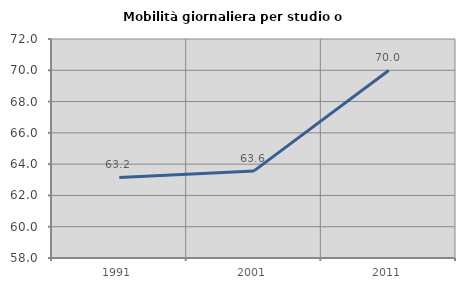
| Category | Mobilità giornaliera per studio o lavoro |
|---|---|
| 1991.0 | 63.152 |
| 2001.0 | 63.567 |
| 2011.0 | 69.991 |